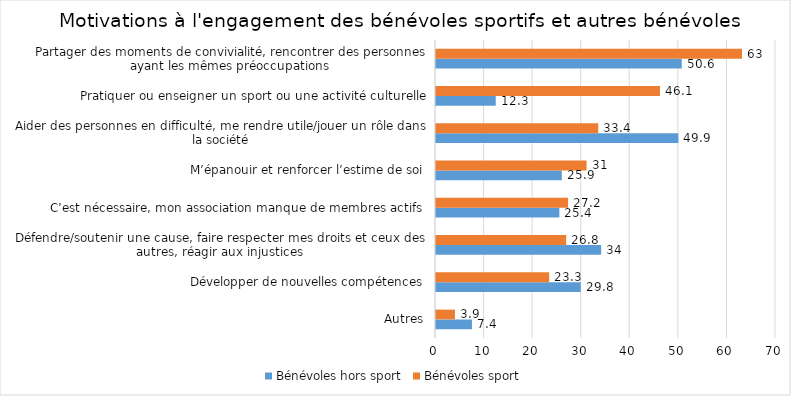
| Category | Bénévoles hors sport | Bénévoles sport |
|---|---|---|
| Autres | 7.4 | 3.9 |
| Développer de nouvelles compétences | 29.8 | 23.3 |
| Défendre/soutenir une cause, faire respecter mes droits et ceux des autres, réagir aux injustices | 34 | 26.8 |
| C’est nécessaire, mon association manque de membres actifs | 25.4 | 27.2 |
| M’épanouir et renforcer l’estime de soi | 25.9 | 31 |
| Aider des personnes en difficulté, me rendre utile/jouer un rôle dans la société | 49.9 | 33.4 |
| Pratiquer ou enseigner un sport ou une activité culturelle | 12.3 | 46.1 |
| Partager des moments de convivialité, rencontrer des personnes ayant les mêmes préoccupations | 50.6 | 63 |